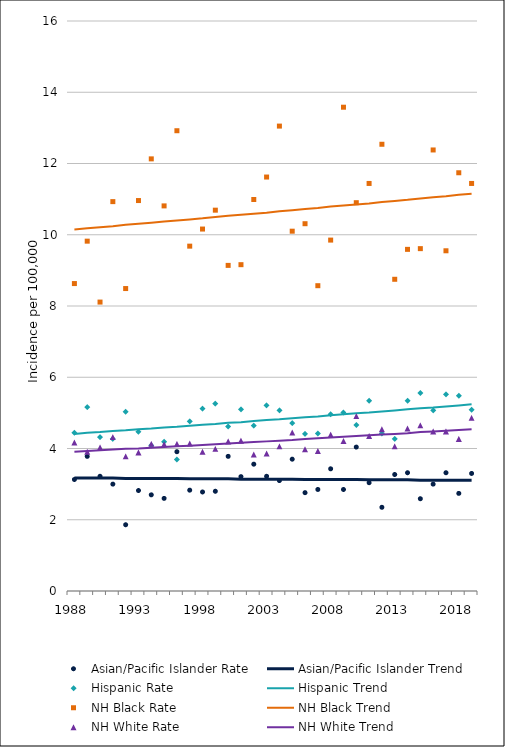
| Category | Asian/Pacific Islander Rate | Asian/Pacific Islander Trend | Hispanic Rate | Hispanic Trend | NH Black Rate | NH Black Trend | NH White Rate | NH White Trend |
|---|---|---|---|---|---|---|---|---|
| 1988.0 | 3.13 | 3.17 | 4.44 | 4.41 | 8.63 | 10.15 | 4.17 | 3.91 |
| 1989.0 | 3.78 | 3.17 | 5.16 | 4.44 | 9.82 | 10.18 | 3.91 | 3.93 |
| 1990.0 | 3.22 | 3.17 | 4.32 | 4.46 | 8.11 | 10.21 | 4.03 | 3.95 |
| 1991.0 | 3 | 3.17 | 4.27 | 4.49 | 10.93 | 10.24 | 4.32 | 3.97 |
| 1992.0 | 1.86 | 3.16 | 5.03 | 4.51 | 8.49 | 10.28 | 3.78 | 3.99 |
| 1993.0 | 2.82 | 3.16 | 4.47 | 4.54 | 10.96 | 10.31 | 3.89 | 4 |
| 1994.0 | 2.7 | 3.16 | 4.09 | 4.56 | 12.13 | 10.34 | 4.13 | 4.02 |
| 1995.0 | 2.6 | 3.16 | 4.19 | 4.59 | 10.81 | 10.37 | 4.12 | 4.04 |
| 1996.0 | 3.91 | 3.16 | 3.69 | 4.61 | 12.92 | 10.4 | 4.13 | 4.06 |
| 1997.0 | 2.83 | 3.15 | 4.76 | 4.64 | 9.68 | 10.43 | 4.14 | 4.08 |
| 1998.0 | 2.78 | 3.15 | 5.12 | 4.67 | 10.16 | 10.46 | 3.91 | 4.1 |
| 1999.0 | 2.8 | 3.15 | 5.26 | 4.69 | 10.69 | 10.5 | 3.99 | 4.12 |
| 2000.0 | 3.78 | 3.15 | 4.62 | 4.72 | 9.14 | 10.53 | 4.2 | 4.14 |
| 2001.0 | 3.21 | 3.14 | 5.1 | 4.74 | 9.16 | 10.56 | 4.22 | 4.16 |
| 2002.0 | 3.56 | 3.14 | 4.64 | 4.77 | 10.99 | 10.59 | 3.83 | 4.18 |
| 2003.0 | 3.22 | 3.14 | 5.21 | 4.8 | 11.62 | 10.62 | 3.86 | 4.2 |
| 2004.0 | 3.1 | 3.14 | 5.07 | 4.82 | 13.05 | 10.66 | 4.06 | 4.22 |
| 2005.0 | 3.7 | 3.14 | 4.71 | 4.85 | 10.1 | 10.69 | 4.45 | 4.24 |
| 2006.0 | 2.76 | 3.13 | 4.41 | 4.88 | 10.31 | 10.72 | 3.98 | 4.27 |
| 2007.0 | 2.85 | 3.13 | 4.42 | 4.9 | 8.57 | 10.75 | 3.93 | 4.29 |
| 2008.0 | 3.43 | 3.13 | 4.96 | 4.93 | 9.85 | 10.79 | 4.39 | 4.31 |
| 2009.0 | 2.85 | 3.13 | 5.01 | 4.96 | 13.58 | 10.82 | 4.21 | 4.33 |
| 2010.0 | 4.04 | 3.13 | 4.66 | 4.99 | 10.9 | 10.85 | 4.91 | 4.35 |
| 2011.0 | 3.04 | 3.12 | 5.34 | 5.01 | 11.44 | 10.88 | 4.35 | 4.37 |
| 2012.0 | 2.35 | 3.12 | 4.42 | 5.04 | 12.54 | 10.92 | 4.54 | 4.39 |
| 2013.0 | 3.27 | 3.12 | 4.27 | 5.07 | 8.75 | 10.95 | 4.06 | 4.41 |
| 2014.0 | 3.32 | 3.12 | 5.34 | 5.1 | 9.59 | 10.98 | 4.56 | 4.43 |
| 2015.0 | 2.59 | 3.11 | 5.56 | 5.13 | 9.61 | 11.02 | 4.65 | 4.46 |
| 2016.0 | 3 | 3.11 | 5.07 | 5.15 | 12.38 | 11.05 | 4.48 | 4.48 |
| 2017.0 | 3.32 | 3.11 | 5.52 | 5.18 | 9.55 | 11.08 | 4.48 | 4.5 |
| 2018.0 | 2.74 | 3.11 | 5.48 | 5.21 | 11.74 | 11.12 | 4.27 | 4.52 |
| 2019.0 | 3.3 | 3.11 | 5.09 | 5.24 | 11.44 | 11.15 | 4.86 | 4.54 |